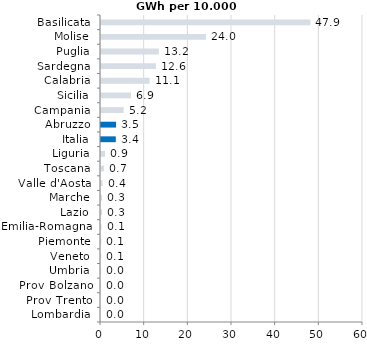
| Category | Series 0 |
|---|---|
| Lombardia | 0 |
| Prov Trento | 0 |
| Prov Bolzano | 0.004 |
| Umbria | 0.031 |
| Veneto | 0.054 |
| Piemonte | 0.07 |
| Emilia-Romagna | 0.119 |
| Lazio | 0.256 |
| Marche | 0.262 |
| Valle d'Aosta | 0.36 |
| Toscana | 0.7 |
| Liguria | 0.912 |
| Italia | 3.387 |
| Abruzzo | 3.451 |
| Campania | 5.189 |
| Sicilia | 6.864 |
| Calabria | 11.137 |
| Sardegna | 12.557 |
| Puglia | 13.244 |
| Molise | 24.025 |
| Basilicata | 47.936 |